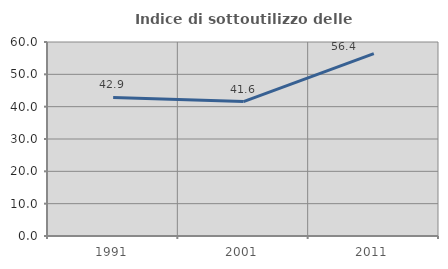
| Category | Indice di sottoutilizzo delle abitazioni  |
|---|---|
| 1991.0 | 42.857 |
| 2001.0 | 41.584 |
| 2011.0 | 56.383 |